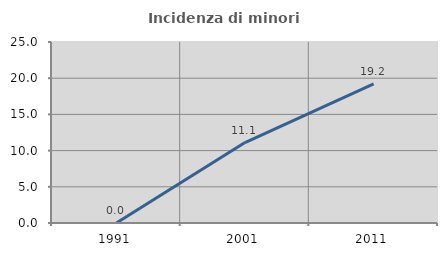
| Category | Incidenza di minori stranieri |
|---|---|
| 1991.0 | 0 |
| 2001.0 | 11.111 |
| 2011.0 | 19.231 |